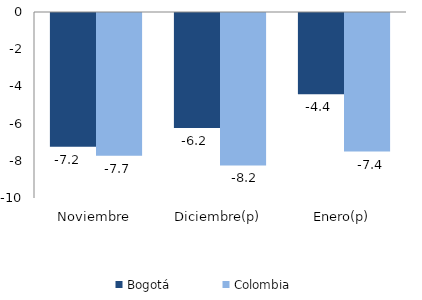
| Category | Bogotá | Colombia |
|---|---|---|
| Noviembre | -7.192 | -7.675 |
| Diciembre(p) | -6.182 | -8.199 |
| Enero(p) | -4.365 | -7.447 |